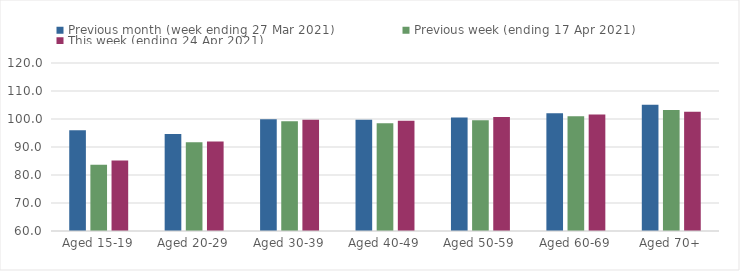
| Category | Previous month (week ending 27 Mar 2021) | Previous week (ending 17 Apr 2021) | This week (ending 24 Apr 2021) |
|---|---|---|---|
| Aged 15-19 | 95.95 | 83.69 | 85.22 |
| Aged 20-29 | 94.62 | 91.73 | 91.99 |
| Aged 30-39 | 99.89 | 99.19 | 99.71 |
| Aged 40-49 | 99.72 | 98.47 | 99.41 |
| Aged 50-59 | 100.56 | 99.58 | 100.69 |
| Aged 60-69 | 102.02 | 100.95 | 101.57 |
| Aged 70+ | 105.06 | 103.2 | 102.55 |